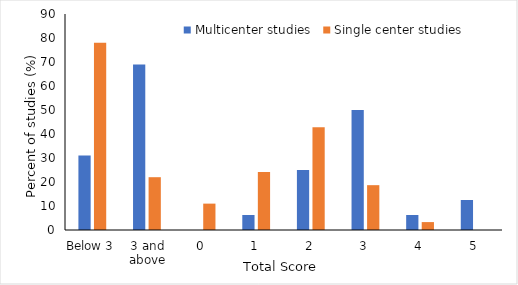
| Category | Multicenter studies  | Single center studies  |
|---|---|---|
| Below 3 | 31 | 78 |
| 3 and above | 69 | 22 |
| 0 | 0 | 10.989 |
| 1 | 6.25 | 24.176 |
| 2 | 25 | 42.857 |
| 3 | 50 | 18.681 |
| 4 | 6.25 | 3.297 |
| 5 | 12.5 | 0 |